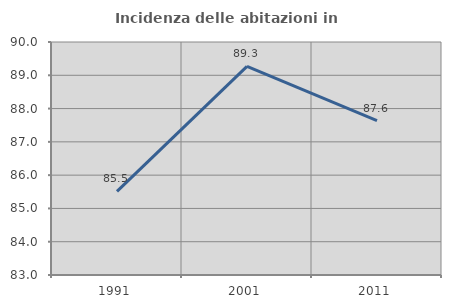
| Category | Incidenza delle abitazioni in proprietà  |
|---|---|
| 1991.0 | 85.514 |
| 2001.0 | 89.269 |
| 2011.0 | 87.639 |